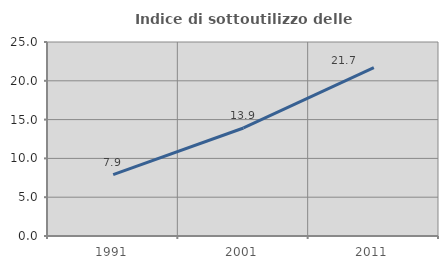
| Category | Indice di sottoutilizzo delle abitazioni  |
|---|---|
| 1991.0 | 7.92 |
| 2001.0 | 13.92 |
| 2011.0 | 21.695 |